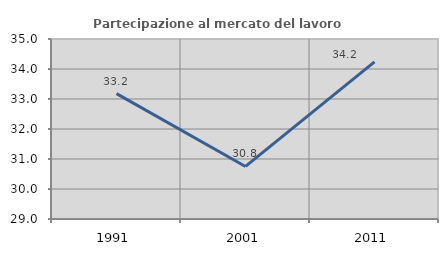
| Category | Partecipazione al mercato del lavoro  femminile |
|---|---|
| 1991.0 | 33.179 |
| 2001.0 | 30.752 |
| 2011.0 | 34.235 |